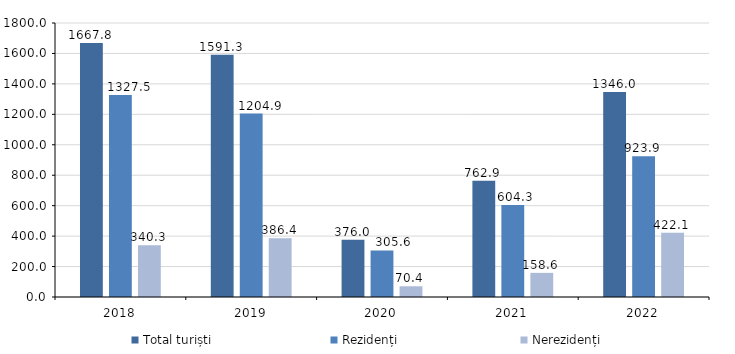
| Category | Total turiști | Rezidenți  | Nerezidenți |
|---|---|---|---|
| 2018.0 | 1667.8 | 1327.5 | 340.3 |
| 2019.0 | 1591.3 | 1204.9 | 386.4 |
| 2020.0 | 376 | 305.6 | 70.4 |
| 2021.0 | 762.9 | 604.3 | 158.6 |
| 2022.0 | 1346 | 923.9 | 422.1 |